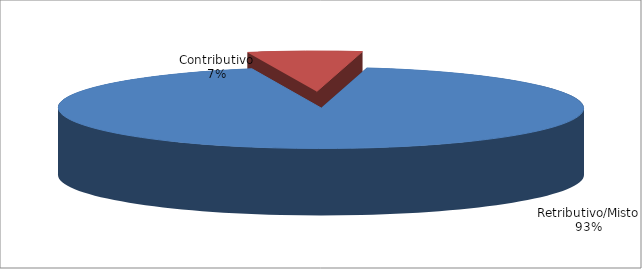
| Category | Series 1 |
|---|---|
| Retributivo/Misto | 223013 |
| Contributivo | 16812 |